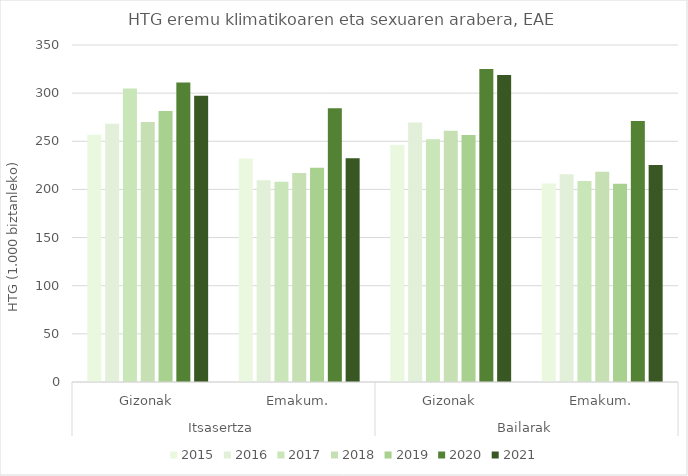
| Category | 2015 | 2016 | 2017 | 2018 | 2019 | 2020 | 2021 |
|---|---|---|---|---|---|---|---|
| 0 | 256.709 | 268.279 | 304.783 | 270.096 | 281.497 | 311.061 | 297.302 |
| 1 | 232.171 | 209.472 | 208.029 | 217.18 | 222.545 | 284.388 | 232.288 |
| 2 | 246.125 | 269.468 | 252.04 | 260.819 | 256.556 | 325.183 | 318.776 |
| 3 | 206.057 | 215.842 | 208.778 | 218.37 | 205.889 | 271.057 | 225.278 |